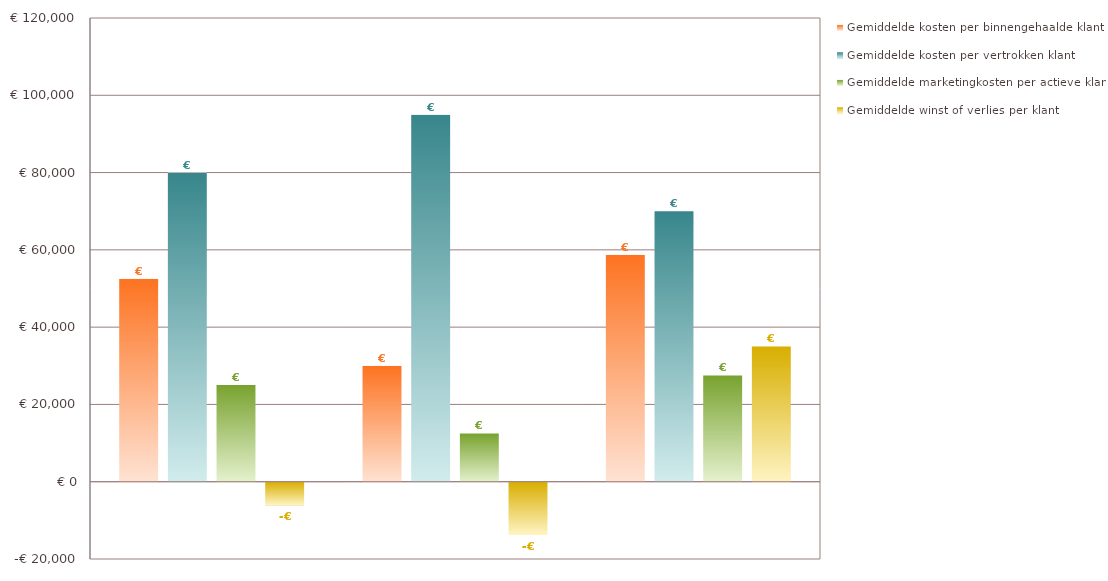
| Category | Gemiddelde kosten per binnengehaalde klant | Gemiddelde kosten per vertrokken klant | Gemiddelde marketingkosten per actieve klant | Gemiddelde winst of verlies per klant |
|---|---|---|---|---|
|  | 52500 | 80000 | 25000 | -5833.333 |
|  | 30000 | 95000 | 12500 | -13500 |
|  | 58750 | 70000 | 27500 | 35000 |